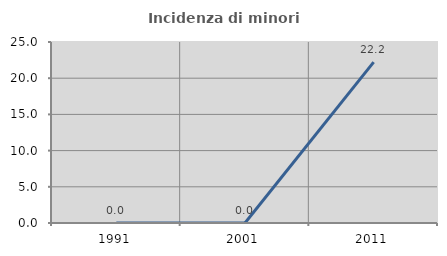
| Category | Incidenza di minori stranieri |
|---|---|
| 1991.0 | 0 |
| 2001.0 | 0 |
| 2011.0 | 22.222 |